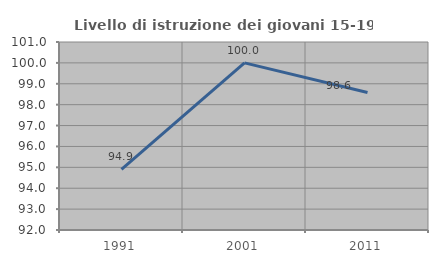
| Category | Livello di istruzione dei giovani 15-19 anni |
|---|---|
| 1991.0 | 94.904 |
| 2001.0 | 100 |
| 2011.0 | 98.582 |